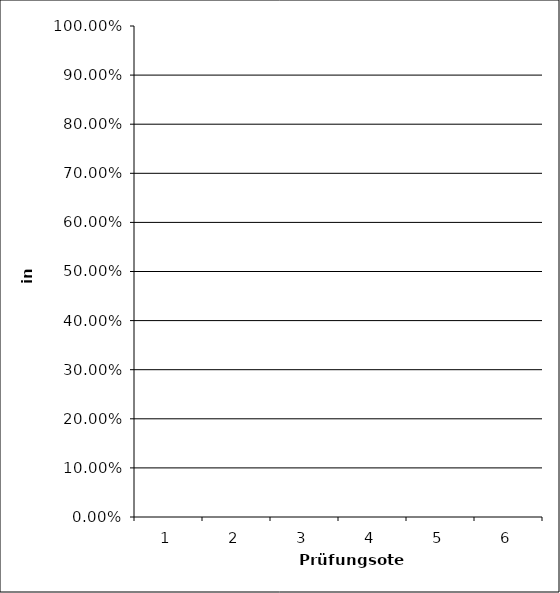
| Category | Series 1 |
|---|---|
| 0 | 0 |
| 1 | 0 |
| 2 | 0 |
| 3 | 0 |
| 4 | 0 |
| 5 | 0 |